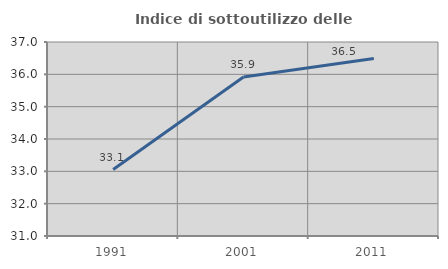
| Category | Indice di sottoutilizzo delle abitazioni  |
|---|---|
| 1991.0 | 33.056 |
| 2001.0 | 35.915 |
| 2011.0 | 36.492 |